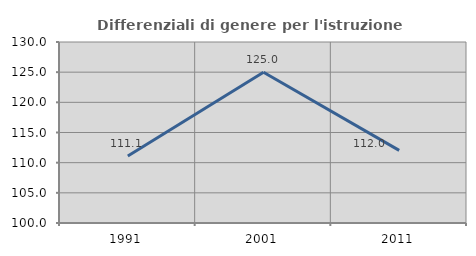
| Category | Differenziali di genere per l'istruzione superiore |
|---|---|
| 1991.0 | 111.102 |
| 2001.0 | 124.986 |
| 2011.0 | 112.031 |